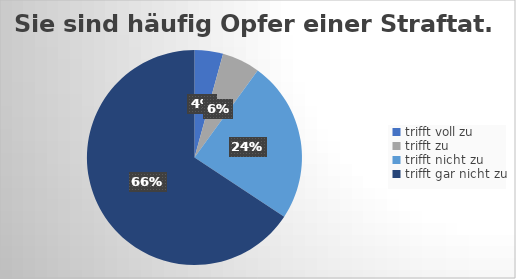
| Category | Sie sind häufig Opfer einer Straftat. |
|---|---|
| trifft voll zu | 12 |
| trifft zu  | 16 |
| trifft nicht zu  | 68 |
| trifft gar nicht zu | 184 |